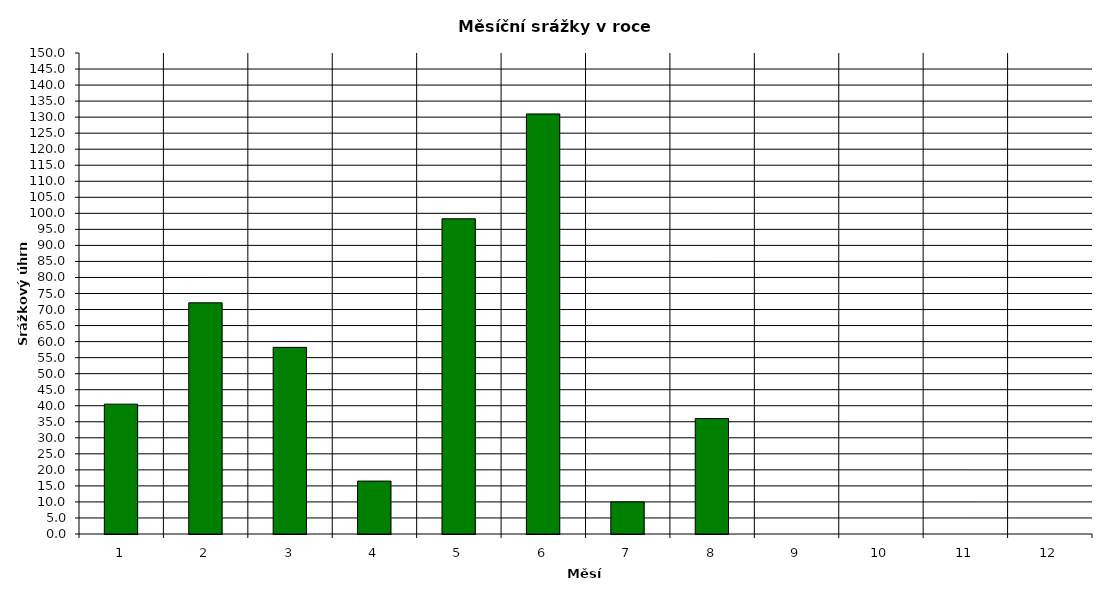
| Category | Series 0 |
|---|---|
| 0 | 40.5 |
| 1 | 72.1 |
| 2 | 58.2 |
| 3 | 16.5 |
| 4 | 98.3 |
| 5 | 131 |
| 6 | 10 |
| 7 | 36 |
| 8 | 0 |
| 9 | 0 |
| 10 | 0 |
| 11 | 0 |